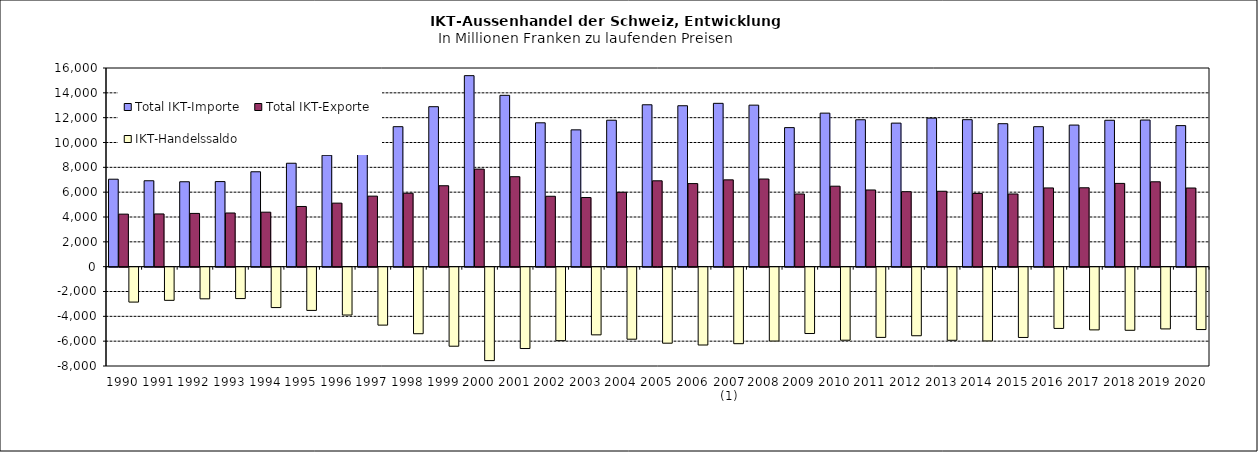
| Category | Total IKT-Importe | Total IKT-Exporte | IKT-Handelssaldo |
|---|---|---|---|
| 1990 | 7043.215 | 4231.191 | -2812.025 |
| 1991 | 6918.332 | 4246.634 | -2671.698 |
| 1992 | 6838.565 | 4288.681 | -2549.884 |
| 1993 | 6851.701 | 4323.053 | -2528.648 |
| 1994 | 7642.126 | 4387.76 | -3254.366 |
| 1995 | 8330.021 | 4847.542 | -3482.479 |
| 1996 | 8972.833 | 5116.856 | -3855.977 |
| 1997 | 10347.863 | 5680.291 | -4667.572 |
| 1998 | 11273.785 | 5913.959 | -5359.826 |
| 1999 | 12883.689 | 6518.032 | -6365.657 |
| 2000 | 15383.908 | 7857.447 | -7526.461 |
| 2001 | 13799.08 | 7246.555 | -6552.524 |
| 2002 | 11586.772 | 5669.087 | -5917.685 |
| 2003 | 11019.238 | 5568.629 | -5450.609 |
| 2004 | 11793.307 | 5992.472 | -5800.835 |
| 2005 | 13038.922 | 6915.251 | -6123.671 |
| 2006 | 12959.973 | 6690.613 | -6269.36 |
| 2007 (1) | 13153.755 | 6991.103 | -6162.652 |
| 2008 | 13008.083 | 7058.679 | -5949.405 |
| 2009 | 11198.456 | 5854.826 | -5343.63 |
| 2010 | 12364.801 | 6480.846 | -5883.955 |
| 2011 | 11831.733 | 6176.012 | -5655.721 |
| 2012 | 11561.378 | 6037.969 | -5523.409 |
| 2013 | 11962.779 | 6073.654 | -5889.124 |
| 2014 | 11838.141 | 5896.203 | -5941.938 |
| 2015 | 11514.94 | 5854.068 | -5660.872 |
| 2016 | 11273.944 | 6339.533 | -4934.411 |
| 2017 | 11404.313 | 6353.539 | -5050.773 |
| 2018 | 11789.619 | 6705.546 | -5084.073 |
| 2019 | 11809.357 | 6836.165 | -4973.191 |
| 2020 | 11359.692 | 6334.668 | -5025.025 |